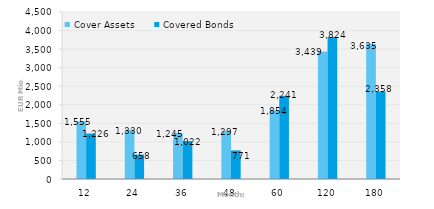
| Category | Cover Assets | Covered Bonds |
|---|---|---|
| 12.0 | 1554.877 | 1225.529 |
| 24.0 | 1329.897 | 657.6 |
| 36.0 | 1244.926 | 1022.231 |
| 48.0 | 1297.018 | 770.84 |
| 60.0 | 1854.347 | 2241.22 |
| 120.0 | 3438.758 | 3823.629 |
| 180.0 | 3634.865 | 2358.063 |